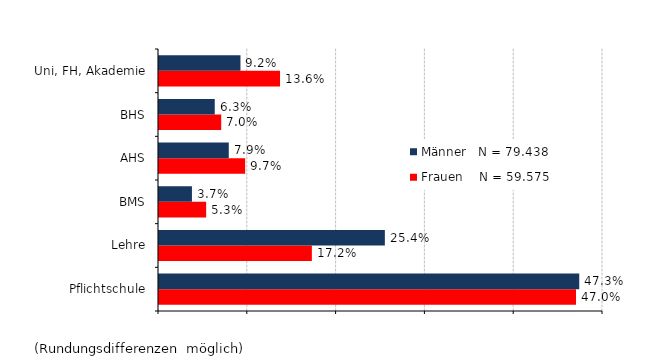
| Category | Frauen    N = 59.575 | Männer   N = 79.438 |
|---|---|---|
| Pflichtschule | 0.47 | 0.473 |
| Lehre | 0.172 | 0.254 |
| BMS | 0.053 | 0.037 |
| AHS | 0.097 | 0.079 |
| BHS | 0.07 | 0.063 |
| Uni, FH, Akademie | 0.136 | 0.092 |